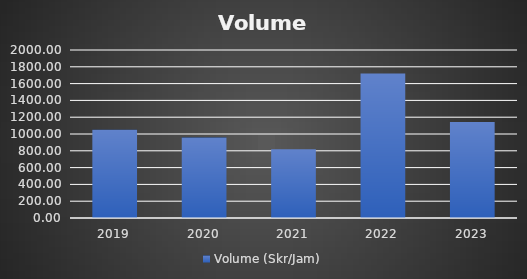
| Category | Volume (Skr/Jam) |
|---|---|
| 2019.0 | 1051.298 |
| 2020.0 | 958.121 |
| 2021.0 | 818.586 |
| 2022.0 | 1720.84 |
| 2023.0 | 1143.482 |